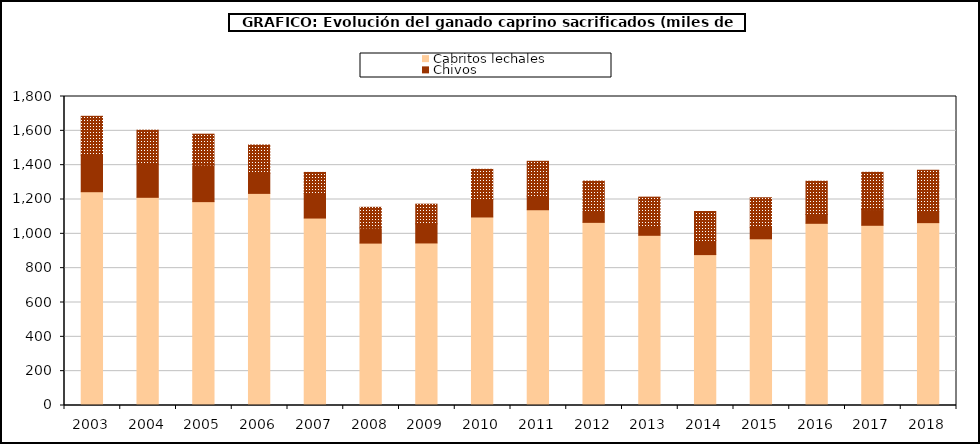
| Category | Cabritos | Chivos | Mayor |
|---|---|---|---|
| 2003.0 | 1245.325 | 212.255 | 227.066 |
| 2004.0 | 1212.757 | 193.057 | 197.929 |
| 2005.0 | 1187.568 | 213.586 | 179.395 |
| 2006.0 | 1235.634 | 116.214 | 165.659 |
| 2007.0 | 1091.939 | 142.795 | 123.018 |
| 2008.0 | 946.005 | 88.612 | 119.891 |
| 2009.0 | 946.871 | 111.232 | 114.664 |
| 2010.0 | 1098.192 | 101.913 | 175.759 |
| 2011.0 | 1140.362 | 79.178 | 203.056 |
| 2012.0 | 1066.793 | 67.733 | 172.561 |
| 2013.0 | 991.445 | 48.941 | 173.365 |
| 2014.0 | 878.99 | 82.198 | 169.027 |
| 2015.0 | 971.043 | 66.091 | 173.135 |
| 2016.0 | 1061.299 | 51.43 | 193.715 |
| 2017.0 | 1049.788 | 91.752 | 216.862 |
| 2018.0 | 1065.202 | 67.41 | 238.414 |